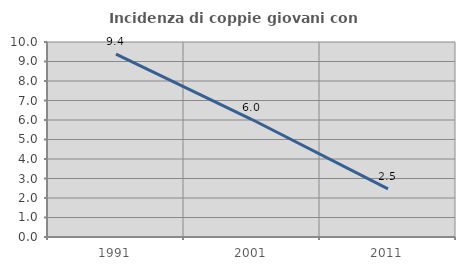
| Category | Incidenza di coppie giovani con figli |
|---|---|
| 1991.0 | 9.375 |
| 2001.0 | 6.024 |
| 2011.0 | 2.469 |